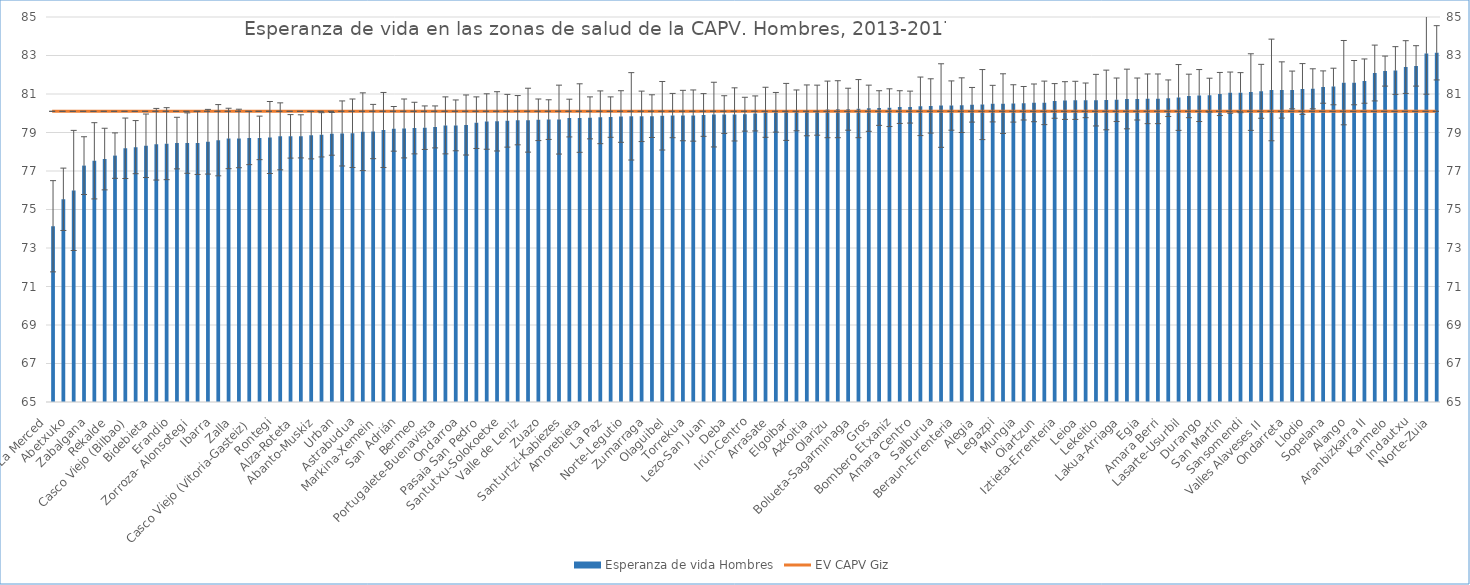
| Category | ZS_OSI | Esperanza de vida Hombres |
|---|---|---|
| La Merced  | 0 | 74.13 |
| Miribilla  | 0 | 75.53 |
| Abetxuko  | 0 | 75.99 |
| Otxarkoaga  | 0 | 77.28 |
| Zabalgana  | 0 | 77.53 |
| La Peña  | 0 | 77.62 |
| Rekalde  | 0 | 77.8 |
| Mina del Morro  | 0 | 78.18 |
| Casco Viejo (Bilbao)  | 0 | 78.24 |
| Pasaia Antxo  | 0 | 78.31 |
| Bidebieta  | 0 | 78.39 |
| Zaramaga  | 0 | 78.42 |
| Erandio  | 0 | 78.45 |
| Intxaurrondo  | 0 | 78.45 |
| Zorroza- Alonsotegi  | 0 | 78.46 |
| Lutxana  | 0 | 78.52 |
| Ibarra  | 0 | 78.6 |
| Sodupe-Güeñes  | 0 | 78.69 |
| Zalla  | 0 | 78.69 |
| Trapagaran  | 0 | 78.71 |
| Casco Viejo (Vitoria-Gasteiz)  | 0 | 78.72 |
| Ortuella  | 0 | 78.74 |
| Rontegi  | 0 | 78.8 |
| Tolosa  | 0 | 78.8 |
| Alza-Roteta  | 0 | 78.8 |
| Azpeitia  | 0 | 78.86 |
| Abanto-Muskiz  | 0 | 78.88 |
| Markonzaga  | 0 | 78.93 |
| Urban  | 0 | 78.95 |
| Loiola  | 0 | 78.96 |
| Astrabudua  | 0 | 79.04 |
| Villabona  | 0 | 79.05 |
| Markina-Xemein  | 0 | 79.13 |
| Santurtzi-Centro-Mamariga  | 0 | 79.19 |
| San Adrián  | 0 | 79.21 |
| Ordizia  | 0 | 79.23 |
| Bermeo  | 0 | 79.25 |
| Zumaia-Zestoa-Getaria  | 0 | 79.29 |
| Portugalete-Buenavista  | 0 | 79.37 |
| Kueto  | 0 | 79.37 |
| Ondarroa  | 0 | 79.39 |
| Zaballa  | 0 | 79.51 |
| Pasaia San Pedro  | 0 | 79.57 |
| Rioja Alavesa  | 0 | 79.58 |
| Santutxu-Solokoetxe  | 0 | 79.61 |
| Txurdinaga  | 0 | 79.64 |
| Valle de Leniz  | 0 | 79.64 |
| San Vicente  | 0 | 79.66 |
| Zuazo  | 0 | 79.67 |
| Begoña  | 0 | 79.67 |
| Santurtzi-Kabiezes  | 0 | 79.75 |
| Lazkao  | 0 | 79.75 |
| Amorebieta  | 0 | 79.76 |
| Arratia  | 0 | 79.79 |
| La Paz  | 0 | 79.8 |
| Balmaseda  | 0 | 79.83 |
| Norte-Legutio  | 0 | 79.84 |
| Portugalete-Repelega  | 0 | 79.84 |
| Zumarraga  | 0 | 79.85 |
| Zurbaran  | 0 | 79.87 |
| Olaguibel  | 0 | 79.88 |
| Eibar  | 0 | 79.88 |
| Torrekua  | 0 | 79.88 |
| Basauri-Ariz  | 0 | 79.91 |
| Lezo-San Juan  | 0 | 79.93 |
| Dumboa  | 0 | 79.93 |
| Deba  | 0 | 79.94 |
| Hernani-Urnieta-Astigarraga  | 0 | 79.95 |
| Irún-Centro  | 0 | 79.99 |
| Basauri-Kareaga  | 0 | 80.05 |
| Arrasate  | 0 | 80.05 |
| Etxebarri  | 0 | 80.07 |
| Elgoibar  | 0 | 80.15 |
| Andoain  | 0 | 80.15 |
| Azkoitia  | 0 | 80.16 |
| Hondarribia  | 0 | 80.2 |
| Olarizu  | 0 | 80.21 |
| Deusto  | 0 | 80.21 |
| Bolueta-Sagarminaga  | 0 | 80.24 |
| Gernika  | 0 | 80.26 |
| Gros  | 0 | 80.27 |
| Abadiño-Elorrio-Berriz  | 0 | 80.29 |
| Bombero Etxaniz  | 0 | 80.32 |
| Las Arenas  | 0 | 80.32 |
| Amara Centro  | 0 | 80.36 |
| Gernikaldea  | 0 | 80.38 |
| Salburua  | 0 | 80.4 |
| Ermua  | 0 | 80.4 |
| Beraun-Errenteria  | 0 | 80.42 |
| Galdakao  | 0 | 80.44 |
| Alegia  | 0 | 80.45 |
| Aiala  | 0 | 80.5 |
| Legazpi  | 0 | 80.5 |
| Gazteleku  | 0 | 80.51 |
| Mungia  | 0 | 80.52 |
| Basurto  | 0 | 80.54 |
| Oiartzun  | 0 | 80.54 |
| San Ignacio  | 0 | 80.64 |
| Iztieta-Errenteria  | 0 | 80.66 |
| Portugalete-Castaños  | 0 | 80.67 |
| Leioa  | 0 | 80.67 |
| Javier Sáenz de Buruaga  | 0 | 80.68 |
| Lekeitio  | 0 | 80.69 |
| Bergara  | 0 | 80.7 |
| Lakua-Arriaga  | 0 | 80.74 |
| Txorierri  | 0 | 80.74 |
| Egia  | 0 | 80.75 |
| Parte Vieja  | 0 | 80.75 |
| Amara Berri  | 0 | 80.78 |
| Aranbizkarra I  | 0 | 80.82 |
| Lasarte-Usurbil  | 0 | 80.9 |
| Llanada Alavesa  | 0 | 80.92 |
| Durango  | 0 | 80.94 |
| Arrigorriaga  | 0 | 81 |
| San Martín  | 0 | 81.07 |
| Beasain  | 0 | 81.07 |
| Sansomendi  | 0 | 81.1 |
| Lakuabizkarra  | 0 | 81.14 |
| Valles Alaveses II  | 0 | 81.21 |
| Gorliz-Plentzia  | 0 | 81.21 |
| Ondarreta  | 0 | 81.21 |
| Oñati  | 0 | 81.26 |
| Llodio  | 0 | 81.27 |
| Zarautz-Orio-Aia  | 0 | 81.36 |
| Sopelana  | 0 | 81.39 |
| Valles Alaveses I  | 0 | 81.59 |
| Alango  | 0 | 81.59 |
| Gazalbide-Txagorritxu  | 0 | 81.67 |
| Aranbizkarra II  | 0 | 82.09 |
| Algorta  | 0 | 82.19 |
| Karmelo  | 0 | 82.22 |
| La Habana  | 0 | 82.4 |
| Indautxu  | 0 | 82.46 |
| Montaña Alavesa  | 0 | 83.1 |
| Norte-Zuia  | 0 | 83.14 |